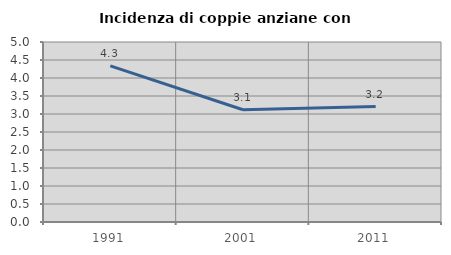
| Category | Incidenza di coppie anziane con figli |
|---|---|
| 1991.0 | 4.337 |
| 2001.0 | 3.119 |
| 2011.0 | 3.206 |